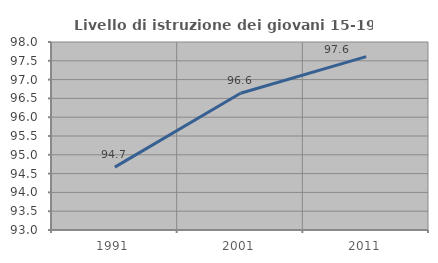
| Category | Livello di istruzione dei giovani 15-19 anni |
|---|---|
| 1991.0 | 94.672 |
| 2001.0 | 96.637 |
| 2011.0 | 97.611 |